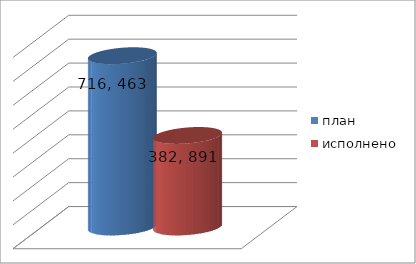
| Category | план | исполнено |
|---|---|---|
| 0 | 716463234.33 | 382891324.47 |